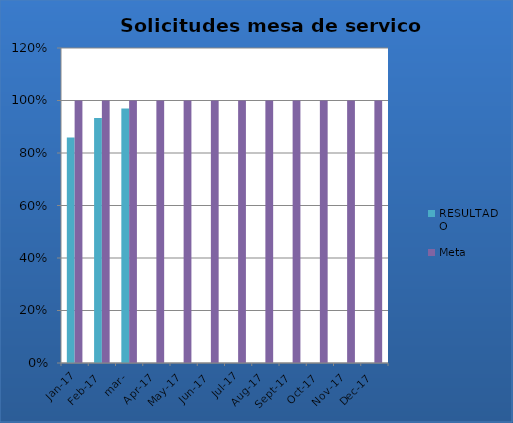
| Category | RESULTADO | Meta |
|---|---|---|
| ene-17 | 0.859 | 1 |
| feb-17 | 0.934 | 1 |
| mar- | 0.969 | 1 |
| abr-17 | 0 | 1 |
| may-17 | 0 | 1 |
| jun-17 | 0 | 1 |
| jul-17 | 0 | 1 |
| ago-17 | 0 | 1 |
| sep-17 | 0 | 1 |
| oct-17 | 0 | 1 |
| nov-17 | 0 | 1 |
| dic-17 | 0 | 1 |